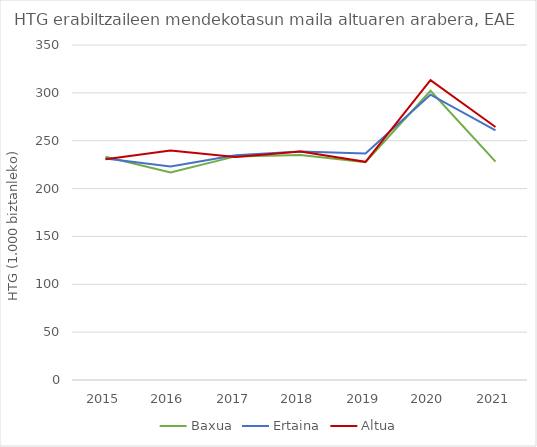
| Category | Baxua | Ertaina | Altua |
|---|---|---|---|
| 2015.0 | 233.26 | 231.401 | 230.739 |
| 2016.0 | 216.851 | 223.158 | 239.702 |
| 2017.0 | 233.636 | 234.856 | 232.934 |
| 2018.0 | 235.084 | 238.793 | 238.683 |
| 2019.0 | 227.5 | 236.591 | 227.945 |
| 2020.0 | 302.136 | 298.042 | 313.277 |
| 2021.0 | 228.157 | 260.708 | 264.379 |